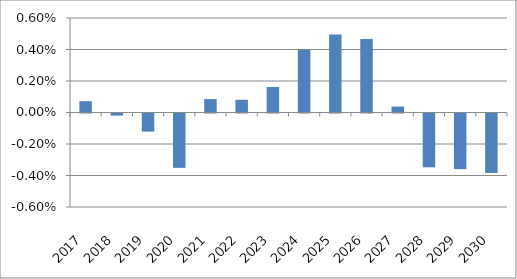
| Category | Series 0 |
|---|---|
| 2017.0 | 0.001 |
| 2018.0 | 0 |
| 2019.0 | -0.001 |
| 2020.0 | -0.003 |
| 2021.0 | 0.001 |
| 2022.0 | 0.001 |
| 2023.0 | 0.002 |
| 2024.0 | 0.004 |
| 2025.0 | 0.005 |
| 2026.0 | 0.005 |
| 2027.0 | 0 |
| 2028.0 | -0.003 |
| 2029.0 | -0.004 |
| 2030.0 | -0.004 |